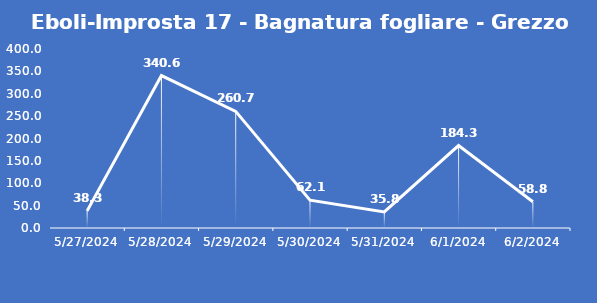
| Category | Eboli-Improsta 17 - Bagnatura fogliare - Grezzo (min) |
|---|---|
| 5/27/24 | 38.3 |
| 5/28/24 | 340.6 |
| 5/29/24 | 260.7 |
| 5/30/24 | 62.1 |
| 5/31/24 | 35.8 |
| 6/1/24 | 184.3 |
| 6/2/24 | 58.8 |